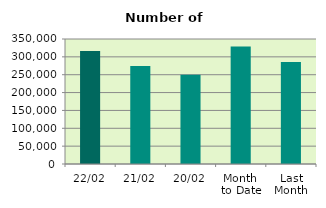
| Category | Series 0 |
|---|---|
| 22/02 | 316326 |
| 21/02 | 274390 |
| 20/02 | 249992 |
| Month 
to Date | 328925.5 |
| Last
Month | 285405.636 |